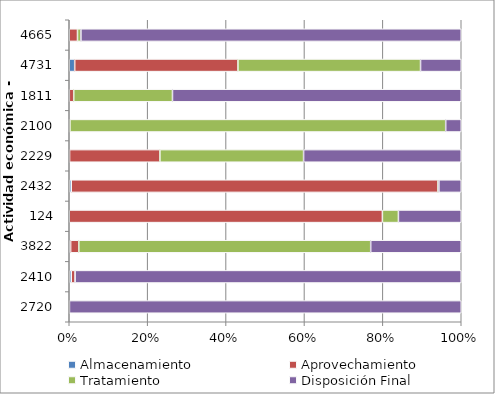
| Category | Almacenamiento | Aprovechamiento | Tratamiento | Disposición Final |
|---|---|---|---|---|
| 2720.0 | 0 | 2199 | 85.8 | 4786540 |
| 2410.0 | 14399.6 | 27720.32 | 25.5 | 2772926.7 |
| 3822.0 | 2715 | 16059.35 | 574558.2 | 178256.38 |
| 124.0 | 0 | 410720.08 | 20988.7 | 82422.84 |
| 2432.0 | 2521.36 | 459377 | 1135 | 28009 |
| 2229.0 | 369 | 108288.84 | 172197.1 | 188952.39 |
| 2100.0 | 7.2 | 776.8 | 419598.7 | 17365.7 |
| 1811.0 | 50 | 4444.6 | 98996.1 | 289508 |
| 4731.0 | 5317 | 159402.2 | 178273.9 | 39755.81 |
| 4665.0 | 0 | 7634.47 | 3176.4 | 352314.73 |